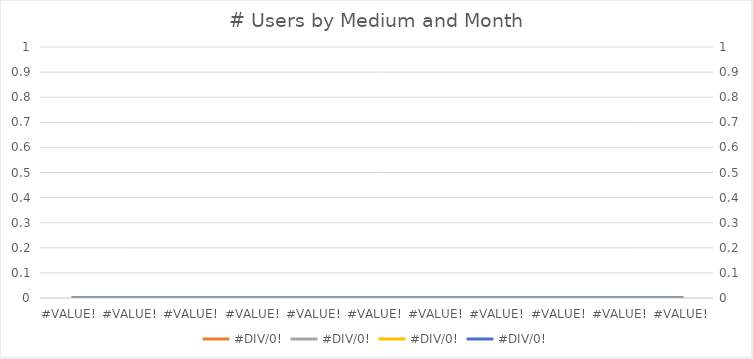
| Category | #JAKO/0! |
|---|---|
| 0.0 | 0 |
| 0.0 | 0 |
| 0.0 | 0 |
| 0.0 | 0 |
| 0.0 | 0 |
| 0.0 | 0 |
| 0.0 | 0 |
| 0.0 | 0 |
| 0.0 | 0 |
| 0.0 | 0 |
| 0.0 | 0 |